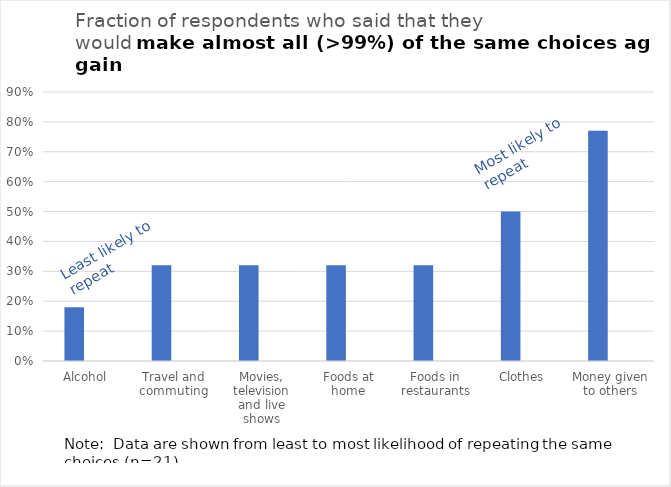
| Category | My own choices (n=21) | Other people's choices (n=22) |
|---|---|---|
| Alcohol | 0.18 | 0.15 |
| Travel and commuting | 0.32 | 0.12 |
| Movies, television and live shows | 0.32 | 0.43 |
| Foods at home | 0.32 | 0.1 |
| Foods in restaurants | 0.32 | 0.15 |
| Clothes | 0.5 | 0.29 |
| Money given to others | 0.77 | 0.62 |